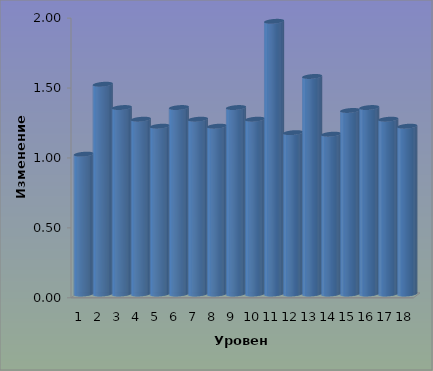
| Category | Series 0 |
|---|---|
| 0 | 1 |
| 1 | 1.5 |
| 2 | 1.333 |
| 3 | 1.25 |
| 4 | 1.2 |
| 5 | 1.333 |
| 6 | 1.25 |
| 7 | 1.2 |
| 8 | 1.333 |
| 9 | 1.25 |
| 10 | 1.95 |
| 11 | 1.154 |
| 12 | 1.556 |
| 13 | 1.143 |
| 14 | 1.312 |
| 15 | 1.333 |
| 16 | 1.25 |
| 17 | 1.2 |